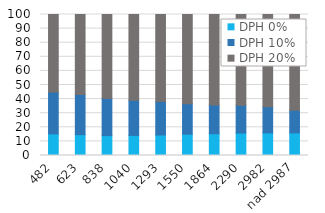
| Category | DPH 0% | DPH 10% | DPH 20% |
|---|---|---|---|
| 482 | 15.324 | 29.678 | 54.998 |
| 623 | 14.752 | 28.502 | 56.746 |
| 838 | 14.102 | 26.411 | 59.487 |
| 1040 | 14.239 | 24.986 | 60.775 |
| 1293 | 14.541 | 23.682 | 61.777 |
| 1550 | 15.128 | 21.601 | 63.271 |
| 1864 | 15.452 | 20.378 | 64.17 |
| 2290 | 15.925 | 19.78 | 64.295 |
| 2982 | 16.003 | 18.509 | 65.488 |
| nad 2987 | 16.029 | 16.14 | 67.831 |